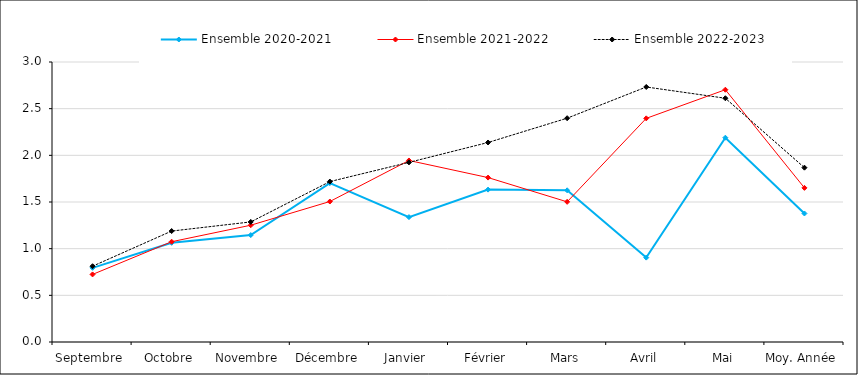
| Category | Ensemble |
|---|---|
| Septembre | 0.812 |
| Octobre | 1.189 |
| Novembre | 1.287 |
| Décembre | 1.719 |
| Janvier | 1.925 |
| Février | 2.138 |
| Mars | 2.398 |
| Avril | 2.732 |
| Mai | 2.612 |
| Moy. Année | 1.868 |